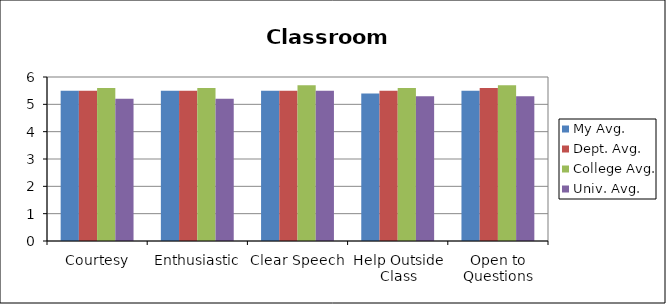
| Category | My Avg. | Dept. Avg. | College Avg. | Univ. Avg. |
|---|---|---|---|---|
| Courtesy | 5.5 | 5.5 | 5.6 | 5.2 |
| Enthusiastic | 5.5 | 5.5 | 5.6 | 5.2 |
| Clear Speech | 5.5 | 5.5 | 5.7 | 5.5 |
| Help Outside Class | 5.4 | 5.5 | 5.6 | 5.3 |
| Open to Questions | 5.5 | 5.6 | 5.7 | 5.3 |